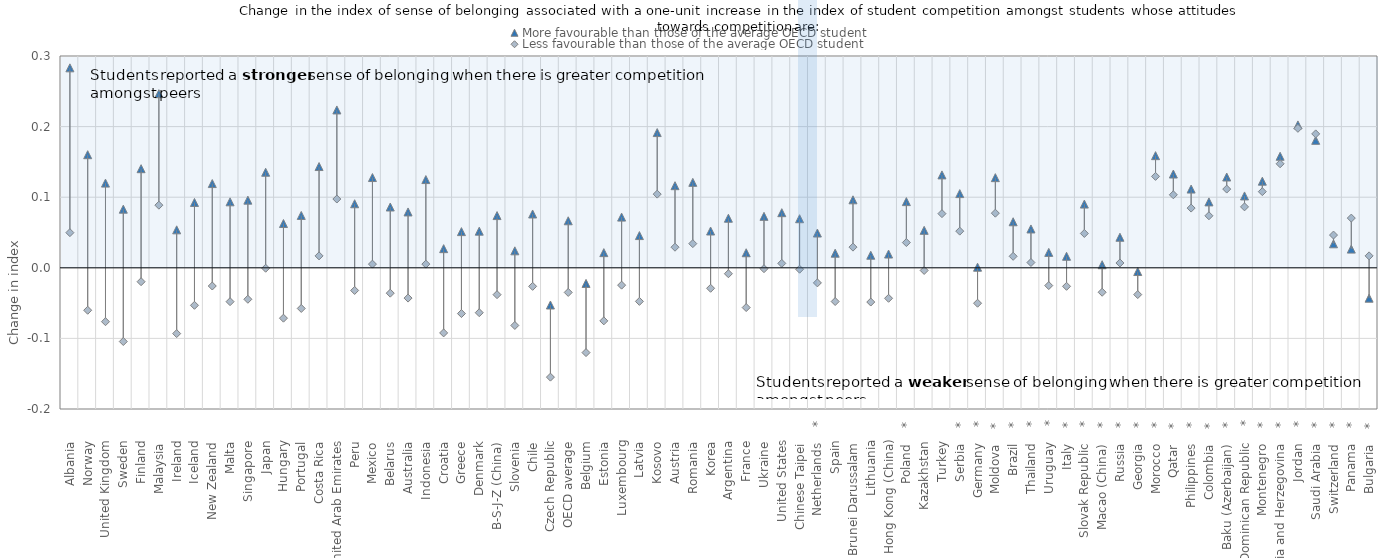
| Category | More favourable than those of the average OECD student | Less favourable than those of the average OECD student |
|---|---|---|
| Albania      | 0.283 | 0.05 |
| Norway      | 0.16 | -0.06 |
| United Kingdom      | 0.12 | -0.076 |
| Sweden      | 0.083 | -0.104 |
| Finland      | 0.14 | -0.02 |
| Malaysia      | 0.247 | 0.089 |
| Ireland      | 0.054 | -0.093 |
| Iceland      | 0.093 | -0.053 |
| New Zealand      | 0.119 | -0.026 |
| Malta      | 0.093 | -0.048 |
| Singapore      | 0.096 | -0.045 |
| Japan      | 0.135 | -0.001 |
| Hungary      | 0.063 | -0.071 |
| Portugal      | 0.074 | -0.058 |
| Costa Rica      | 0.143 | 0.017 |
| United Arab Emirates      | 0.224 | 0.097 |
| Peru      | 0.091 | -0.032 |
| Mexico      | 0.128 | 0.005 |
| Belarus      | 0.086 | -0.036 |
| Australia      | 0.079 | -0.043 |
| Indonesia      | 0.125 | 0.005 |
| Croatia      | 0.027 | -0.092 |
| Greece      | 0.051 | -0.065 |
| Denmark      | 0.052 | -0.064 |
| B-S-J-Z (China)      | 0.074 | -0.038 |
| Slovenia      | 0.024 | -0.082 |
| Chile      | 0.076 | -0.026 |
| Czech Republic      | -0.053 | -0.155 |
| OECD average      | 0.067 | -0.035 |
| Belgium      | -0.022 | -0.12 |
| Estonia      | 0.021 | -0.075 |
| Luxembourg      | 0.072 | -0.025 |
| Latvia      | 0.046 | -0.048 |
| Kosovo      | 0.192 | 0.104 |
| Austria      | 0.116 | 0.029 |
| Romania      | 0.121 | 0.034 |
| Korea      | 0.052 | -0.029 |
| Argentina      | 0.07 | -0.008 |
| France      | 0.021 | -0.056 |
| Ukraine      | 0.073 | -0.001 |
| United States      | 0.078 | 0.006 |
| Chinese Taipei      | 0.069 | -0.002 |
| Netherlands    * | 0.049 | -0.021 |
| Spain      | 0.021 | -0.048 |
| Brunei Darussalam      | 0.096 | 0.029 |
| Lithuania      | 0.018 | -0.049 |
| Hong Kong (China)      | 0.02 | -0.043 |
| Poland    * | 0.094 | 0.036 |
| Kazakhstan      | 0.053 | -0.004 |
| Turkey      | 0.132 | 0.077 |
| Serbia    * | 0.105 | 0.052 |
| Germany    * | 0.001 | -0.05 |
| Moldova    * | 0.128 | 0.077 |
| Brazil    * | 0.065 | 0.016 |
| Thailand    * | 0.055 | 0.007 |
| Uruguay    * | 0.022 | -0.025 |
| Italy    * | 0.016 | -0.026 |
| Slovak Republic    * | 0.09 | 0.049 |
| Macao (China)    * | 0.004 | -0.035 |
| Russia    * | 0.043 | 0.007 |
| Georgia    * | -0.005 | -0.038 |
| Morocco    * | 0.159 | 0.129 |
| Qatar    * | 0.133 | 0.103 |
| Philippines    * | 0.112 | 0.085 |
| Colombia    * | 0.093 | 0.074 |
| Baku (Azerbaijan)    * | 0.129 | 0.112 |
| Dominican Republic    * | 0.102 | 0.086 |
| Montenegro    * | 0.123 | 0.108 |
| Bosnia and Herzegovina    * | 0.158 | 0.147 |
| Jordan    * | 0.202 | 0.198 |
| Saudi Arabia    * | 0.181 | 0.19 |
| Switzerland    * | 0.034 | 0.046 |
| Panama    * | 0.026 | 0.07 |
| Bulgaria    * | -0.043 | 0.017 |